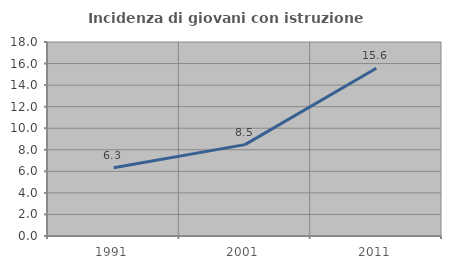
| Category | Incidenza di giovani con istruzione universitaria |
|---|---|
| 1991.0 | 6.331 |
| 2001.0 | 8.477 |
| 2011.0 | 15.567 |